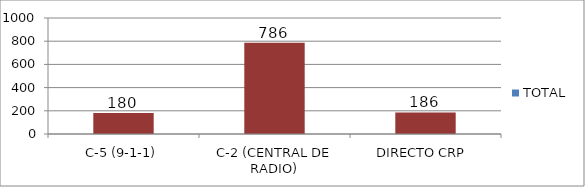
| Category | TOTAL |
|---|---|
| C-5 (9-1-1) | 180 |
| C-2 (CENTRAL DE RADIO) | 786 |
| DIRECTO CRP  | 186 |